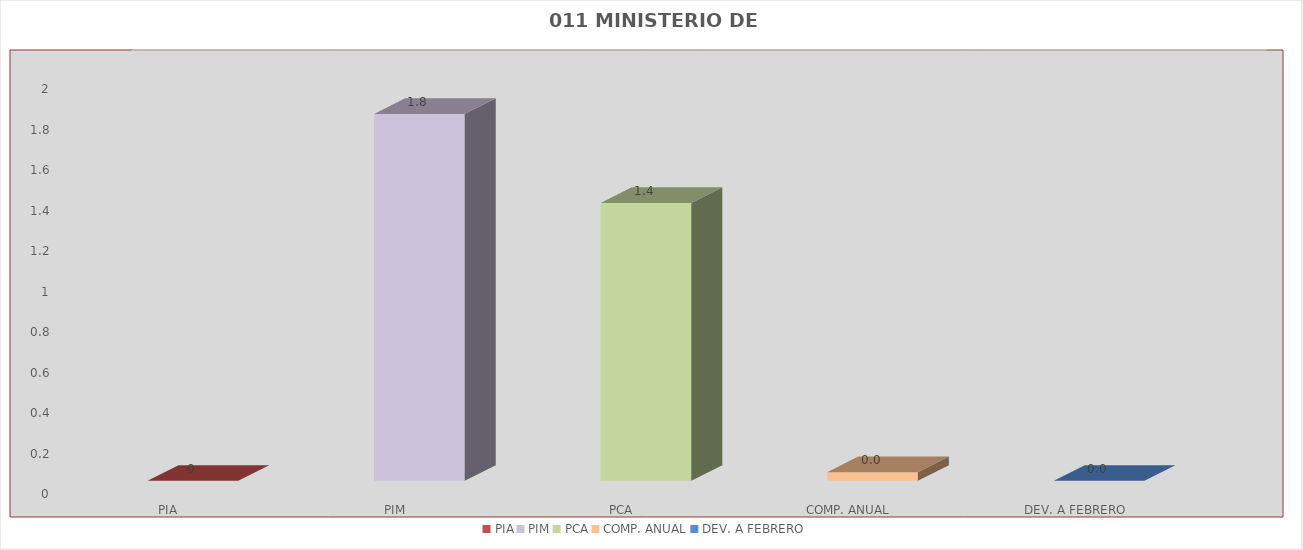
| Category | 011 MINISTERIO DE SALUD |
|---|---|
| PIA | 0 |
| PIM | 1.813 |
| PCA | 1.373 |
| COMP. ANUAL | 0.043 |
| DEV. A FEBRERO | 0 |